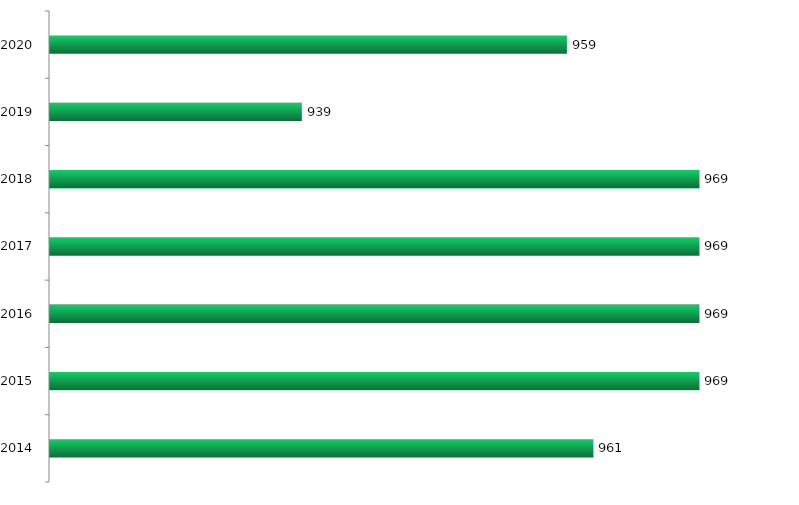
| Category | Vagas ofertadas |
|---|---|
| 2014.0 | 961 |
| 2015.0 | 969 |
| 2016.0 | 969 |
| 2017.0 | 969 |
| 2018.0 | 969 |
| 2019.0 | 939 |
| 2020.0 | 959 |